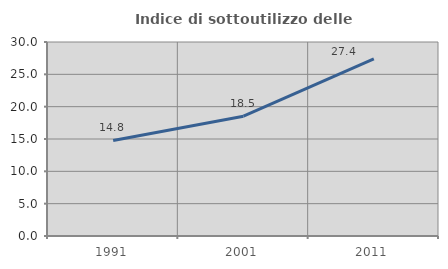
| Category | Indice di sottoutilizzo delle abitazioni  |
|---|---|
| 1991.0 | 14.773 |
| 2001.0 | 18.533 |
| 2011.0 | 27.387 |